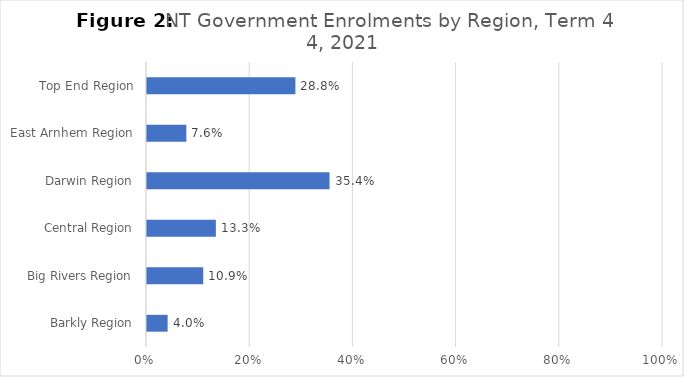
| Category | Series 0 |
|---|---|
| Barkly Region | 0.04 |
| Big Rivers Region | 0.109 |
| Central Region | 0.133 |
| Darwin Region | 0.354 |
| East Arnhem Region | 0.076 |
| Top End Region | 0.288 |